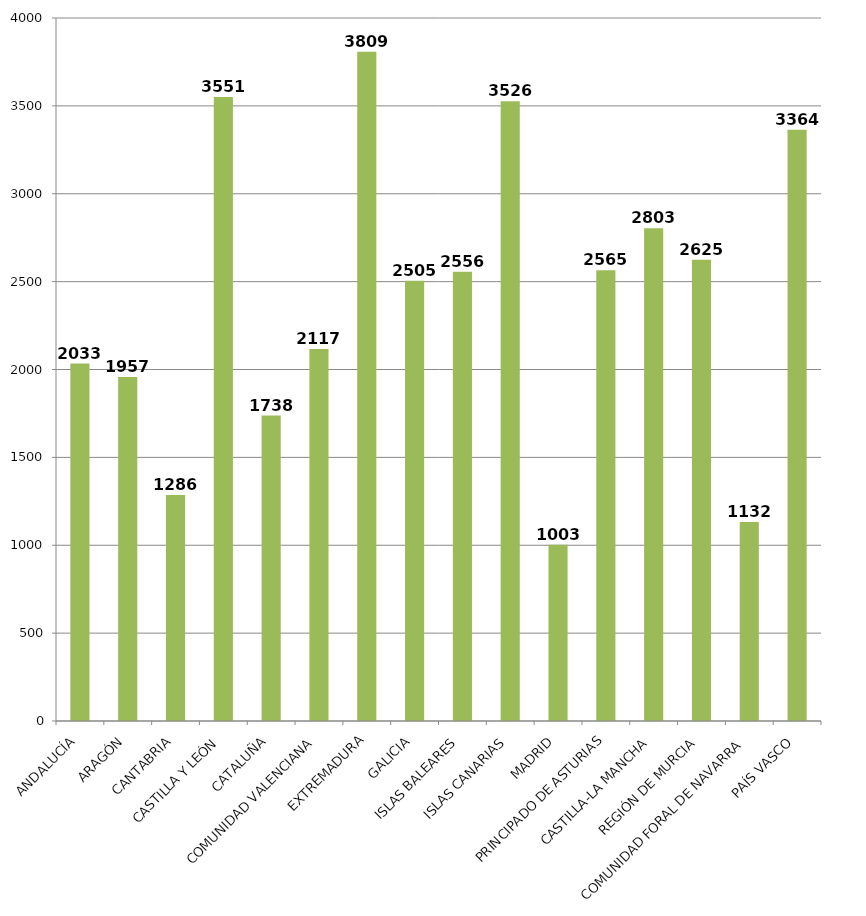
| Category | Total |
|---|---|
| ANDALUCÍA | 2033.471 |
| ARAGÓN | 1957.333 |
| CANTABRIA | 1286 |
| CASTILLA Y LEÓN | 3550.5 |
| CATALUÑA | 1737.864 |
| COMUNIDAD VALENCIANA | 2116.75 |
| EXTREMADURA | 3808.5 |
| GALICIA | 2505.4 |
| ISLAS BALEARES | 2555.5 |
| ISLAS CANARIAS | 3526.4 |
| MADRID | 1002.864 |
| PRINCIPADO DE ASTURIAS | 2565 |
| CASTILLA-LA MANCHA | 2803.4 |
| REGIÓN DE MURCIA | 2625 |
| COMUNIDAD FORAL DE NAVARRA | 1132.333 |
| PAÍS VASCO | 3363.5 |